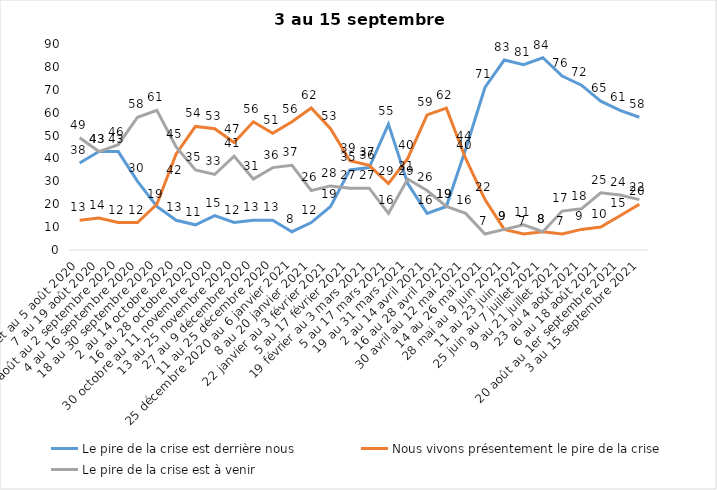
| Category | Le pire de la crise est derrière nous | Nous vivons présentement le pire de la crise | Le pire de la crise est à venir |
|---|---|---|---|
| 24 juillet au 5 août 2020 | 38 | 13 | 49 |
| 7 au 19 août 2020 | 43 | 14 | 43 |
| 21 août au 2 septembre 2020 | 43 | 12 | 46 |
| 4 au 16 septembre 2020 | 30 | 12 | 58 |
| 18 au 30 septembre 2020 | 19 | 20 | 61 |
| 2 au 14 octobre 2020 | 13 | 42 | 45 |
| 16 au 28 octobre 2020 | 11 | 54 | 35 |
| 30 octobre au 11 novembre 2020 | 15 | 53 | 33 |
| 13 au 25 novembre 2020 | 12 | 47 | 41 |
| 27 au 9 décembre 2020 | 13 | 56 | 31 |
| 11 au 25 décembre 2020 | 13 | 51 | 36 |
| 25 décembre 2020 au 6 janvier 2021 | 8 | 56 | 37 |
| 8 au 20 janvier 2021 | 12 | 62 | 26 |
| 22 janvier au 3 février 2021 | 19 | 53 | 28 |
| 5 au 17 février 2021 | 35 | 39 | 27 |
| 19 février au 3 mars 2021 | 36 | 37 | 27 |
| 5 au 17 mars 2021 | 55 | 29 | 16 |
| 19 au 31 mars 2021 | 29 | 40 | 31 |
| 2 au 14 avril 2021 | 16 | 59 | 26 |
| 16 au 28 avril 2021 | 19 | 62 | 19 |
| 30 avril au 12 mai 2021 | 44 | 40 | 16 |
| 14 au 26 mai 2021 | 71 | 22 | 7 |
| 28 mai au 9 juin 2021 | 83 | 9 | 9 |
| 11 au 23 juin 2021 | 81 | 7 | 11 |
| 25 juin au 7 juillet 2021 | 84 | 8 | 8 |
| 9 au 21 juillet 2021 | 76 | 7 | 17 |
| 23 au 4 août 2021 | 72 | 9 | 18 |
| 6 au 18 août 2021 | 65 | 10 | 25 |
| 20 août au 1er septembre 2021 | 61 | 15 | 24 |
| 3 au 15 septembre 2021 | 58 | 20 | 22 |